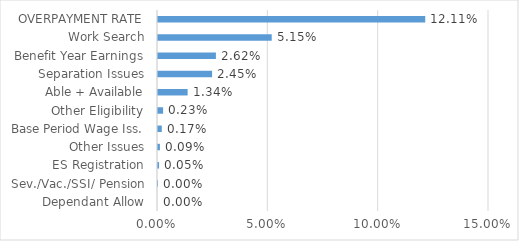
| Category | Series 0 |
|---|---|
| Dependant Allow | 0 |
| Sev./Vac./SSI/ Pension | 0 |
| ES Registration | 0 |
| Other Issues | 0.001 |
| Base Period Wage Iss. | 0.002 |
| Other Eligibility | 0.002 |
| Able + Available | 0.013 |
| Separation Issues | 0.025 |
| Benefit Year Earnings | 0.026 |
| Work Search | 0.052 |
| OVERPAYMENT RATE | 0.121 |